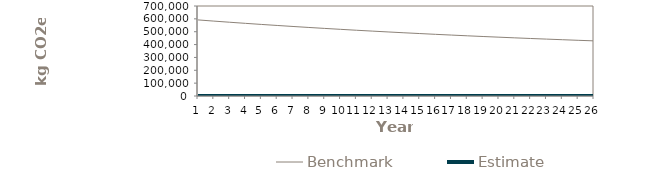
| Category | Benchmark | Estimate |
|---|---|---|
| 0 | 591762.202 | 0 |
| 1 | 582591.777 | 0 |
| 2 | 573696.464 | 0 |
| 3 | 565068.011 | 0 |
| 4 | 556698.412 | 0 |
| 5 | 548579.9 | 0 |
| 6 | 540704.944 | 0 |
| 7 | 533066.236 | 0 |
| 8 | 525656.69 | 0 |
| 9 | 518469.43 | 0 |
| 10 | 511497.788 | 0 |
| 11 | 504735.295 | 0 |
| 12 | 498175.677 | 0 |
| 13 | 491812.848 | 0 |
| 14 | 485640.903 | 0 |
| 15 | 479654.117 | 0 |
| 16 | 473846.934 | 0 |
| 17 | 468213.967 | 0 |
| 18 | 462749.989 | 0 |
| 19 | 457449.93 | 0 |
| 20 | 452308.873 | 0 |
| 21 | 447322.047 | 0 |
| 22 | 442484.827 | 0 |
| 23 | 437792.723 | 0 |
| 24 | 433241.382 | 0 |
| 25 | 428826.581 | 0 |